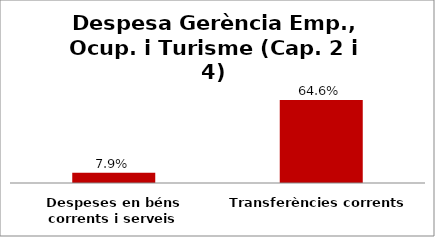
| Category | Series 0 |
|---|---|
| Despeses en béns corrents i serveis | 0.079 |
| Transferències corrents | 0.646 |